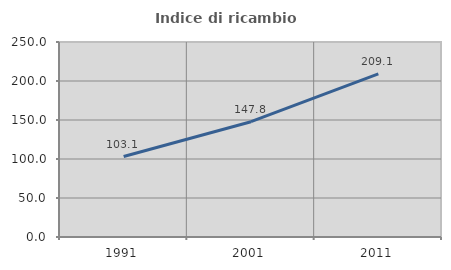
| Category | Indice di ricambio occupazionale  |
|---|---|
| 1991.0 | 103.125 |
| 2001.0 | 147.826 |
| 2011.0 | 209.091 |